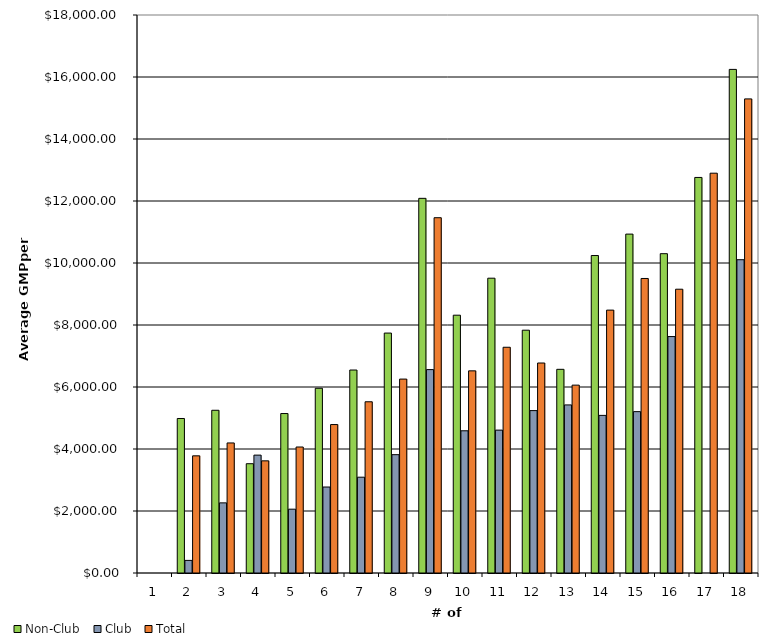
| Category | Non-Club | Club | Total |
|---|---|---|---|
| 1.0 | 0 | 0 | 0 |
| 2.0 | 4984.176 | 406.262 | 3779.462 |
| 3.0 | 5249.441 | 2262.149 | 4195.103 |
| 4.0 | 3525.368 | 3802.697 | 3617.811 |
| 5.0 | 5143.936 | 2058.868 | 4064.162 |
| 6.0 | 5958.68 | 2773.603 | 4788.652 |
| 7.0 | 6547.449 | 3090.718 | 5523.233 |
| 8.0 | 7739.427 | 3817.26 | 6255.364 |
| 9.0 | 12085.954 | 6561.15 | 11460.976 |
| 10.0 | 8316.037 | 4587.683 | 6520.904 |
| 11.0 | 9509.897 | 4608.877 | 7282.161 |
| 12.0 | 7832.519 | 5238.659 | 6773.8 |
| 13.0 | 6570.384 | 5422.062 | 6060.019 |
| 14.0 | 10241.254 | 5084.281 | 8480.336 |
| 15.0 | 10932.318 | 5205.622 | 9500.644 |
| 16.0 | 10300.714 | 7626.664 | 9154.692 |
| 17.0 | 12759.957 | 0 | 12896.822 |
| 18.0 | 16245.03 | 10106.32 | 15293.401 |